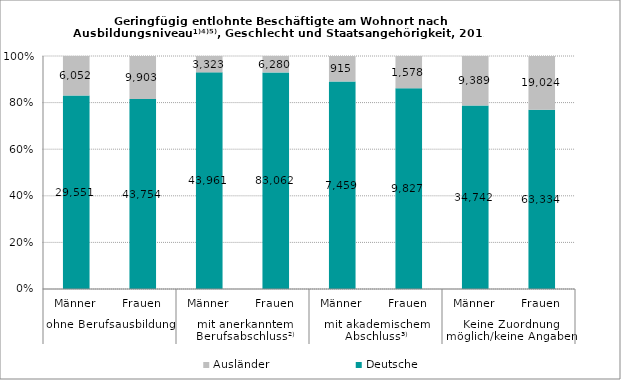
| Category | Deutsche | Ausländer |
|---|---|---|
| 0 | 29551 | 6052 |
| 1 | 43754 | 9903 |
| 2 | 43961 | 3323 |
| 3 | 83062 | 6280 |
| 4 | 7459 | 915 |
| 5 | 9827 | 1578 |
| 6 | 34742 | 9389 |
| 7 | 63334 | 19024 |